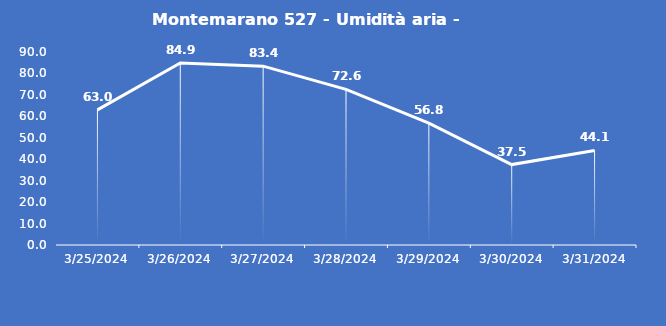
| Category | Montemarano 527 - Umidità aria - Grezzo (%) |
|---|---|
| 3/25/24 | 63 |
| 3/26/24 | 84.9 |
| 3/27/24 | 83.4 |
| 3/28/24 | 72.6 |
| 3/29/24 | 56.8 |
| 3/30/24 | 37.5 |
| 3/31/24 | 44.1 |